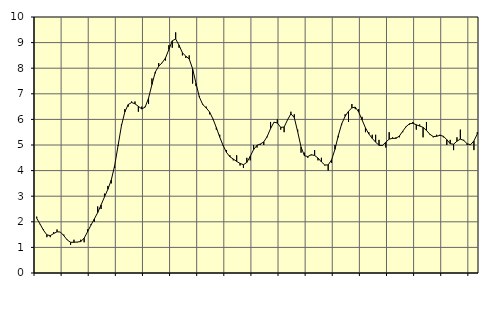
| Category | Piggar | Series 1 |
|---|---|---|
| nan | 2.2 | 2.14 |
| 87.0 | 1.9 | 1.91 |
| 87.0 | 1.7 | 1.67 |
| 87.0 | 1.4 | 1.49 |
| nan | 1.4 | 1.46 |
| 88.0 | 1.6 | 1.54 |
| 88.0 | 1.7 | 1.61 |
| 88.0 | 1.6 | 1.6 |
| nan | 1.5 | 1.46 |
| 89.0 | 1.3 | 1.29 |
| 89.0 | 1.1 | 1.2 |
| 89.0 | 1.3 | 1.2 |
| nan | 1.2 | 1.21 |
| 90.0 | 1.3 | 1.23 |
| 90.0 | 1.2 | 1.36 |
| 90.0 | 1.7 | 1.61 |
| nan | 1.9 | 1.87 |
| 91.0 | 2 | 2.11 |
| 91.0 | 2.6 | 2.36 |
| 91.0 | 2.5 | 2.66 |
| nan | 3.1 | 2.97 |
| 92.0 | 3.4 | 3.27 |
| 92.0 | 3.5 | 3.63 |
| 92.0 | 4.1 | 4.19 |
| nan | 5 | 4.97 |
| 93.0 | 5.8 | 5.75 |
| 93.0 | 6.4 | 6.29 |
| 93.0 | 6.5 | 6.58 |
| nan | 6.7 | 6.66 |
| 94.0 | 6.7 | 6.61 |
| 94.0 | 6.3 | 6.51 |
| 94.0 | 6.5 | 6.41 |
| nan | 6.5 | 6.48 |
| 95.0 | 6.6 | 6.83 |
| 95.0 | 7.6 | 7.36 |
| 95.0 | 7.8 | 7.85 |
| nan | 8.2 | 8.08 |
| 96.0 | 8.2 | 8.21 |
| 96.0 | 8.3 | 8.4 |
| 96.0 | 8.9 | 8.73 |
| nan | 8.8 | 9.07 |
| 97.0 | 9.4 | 9.14 |
| 97.0 | 8.8 | 8.9 |
| 97.0 | 8.5 | 8.6 |
| nan | 8.4 | 8.47 |
| 98.0 | 8.5 | 8.36 |
| 98.0 | 7.4 | 7.98 |
| 98.0 | 7.3 | 7.41 |
| nan | 6.9 | 6.87 |
| 99.0 | 6.6 | 6.58 |
| 99.0 | 6.5 | 6.45 |
| 99.0 | 6.2 | 6.29 |
| nan | 6 | 6.02 |
| 0.0 | 5.6 | 5.68 |
| 0.0 | 5.4 | 5.31 |
| 0.0 | 5 | 4.98 |
| nan | 4.8 | 4.71 |
| 1.0 | 4.6 | 4.54 |
| 1.0 | 4.4 | 4.45 |
| 1.0 | 4.6 | 4.36 |
| nan | 4.2 | 4.28 |
| 2.0 | 4.1 | 4.23 |
| 2.0 | 4.5 | 4.32 |
| 2.0 | 4.4 | 4.56 |
| nan | 5 | 4.82 |
| 3.0 | 4.9 | 4.99 |
| 3.0 | 5 | 5.04 |
| 3.0 | 5 | 5.12 |
| nan | 5.3 | 5.33 |
| 4.0 | 5.9 | 5.64 |
| 4.0 | 5.9 | 5.89 |
| 4.0 | 6 | 5.86 |
| nan | 5.6 | 5.69 |
| 5.0 | 5.5 | 5.7 |
| 5.0 | 6 | 5.98 |
| 5.0 | 6.3 | 6.22 |
| nan | 6.2 | 6.07 |
| 6.0 | 5.6 | 5.52 |
| 6.0 | 4.7 | 4.92 |
| 6.0 | 4.7 | 4.58 |
| nan | 4.5 | 4.55 |
| 7.0 | 4.6 | 4.62 |
| 7.0 | 4.8 | 4.59 |
| 7.0 | 4.4 | 4.49 |
| nan | 4.5 | 4.34 |
| 8.0 | 4.2 | 4.22 |
| 8.0 | 4 | 4.22 |
| 8.0 | 4.3 | 4.42 |
| nan | 5 | 4.83 |
| 9.0 | 5.3 | 5.37 |
| 9.0 | 5.8 | 5.83 |
| 9.0 | 6.2 | 6.12 |
| nan | 5.9 | 6.32 |
| 10.0 | 6.6 | 6.45 |
| 10.0 | 6.4 | 6.48 |
| 10.0 | 6.4 | 6.29 |
| nan | 6.1 | 5.98 |
| 11.0 | 5.5 | 5.67 |
| 11.0 | 5.5 | 5.43 |
| 11.0 | 5.4 | 5.26 |
| nan | 5.4 | 5.11 |
| 12.0 | 5.2 | 4.99 |
| 12.0 | 5 | 4.98 |
| 12.0 | 4.9 | 5.11 |
| nan | 5.5 | 5.23 |
| 13.0 | 5.3 | 5.26 |
| 13.0 | 5.3 | 5.26 |
| 13.0 | 5.3 | 5.35 |
| nan | 5.5 | 5.54 |
| 14.0 | 5.7 | 5.72 |
| 14.0 | 5.8 | 5.83 |
| 14.0 | 5.9 | 5.85 |
| nan | 5.6 | 5.79 |
| 15.0 | 5.8 | 5.74 |
| 15.0 | 5.3 | 5.69 |
| 15.0 | 5.9 | 5.57 |
| nan | 5.4 | 5.42 |
| 16.0 | 5.3 | 5.33 |
| 16.0 | 5.4 | 5.34 |
| 16.0 | 5.4 | 5.38 |
| nan | 5.3 | 5.34 |
| 17.0 | 5 | 5.21 |
| 17.0 | 5.2 | 5.05 |
| 17.0 | 4.8 | 5.03 |
| nan | 5.3 | 5.15 |
| 18.0 | 5.6 | 5.23 |
| 18.0 | 5.2 | 5.18 |
| 18.0 | 5 | 5.05 |
| nan | 5 | 5.01 |
| 19.0 | 4.8 | 5.16 |
| 19.0 | 5.5 | 5.43 |